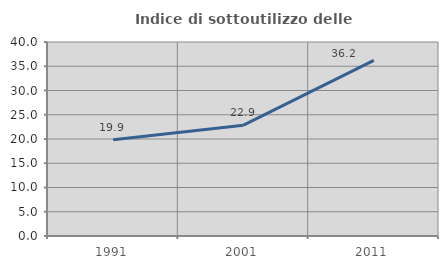
| Category | Indice di sottoutilizzo delle abitazioni  |
|---|---|
| 1991.0 | 19.858 |
| 2001.0 | 22.852 |
| 2011.0 | 36.214 |